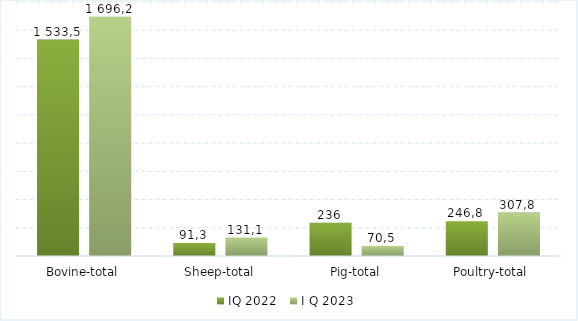
| Category | IQ 2022 | I Q 2023 |
|---|---|---|
| Bovine-total | 1533.5 | 1696.2 |
| Sheep-total | 91.3 | 131.1 |
| Pig-total | 236 | 70.5 |
| Poultry-total | 246.8 | 307.8 |